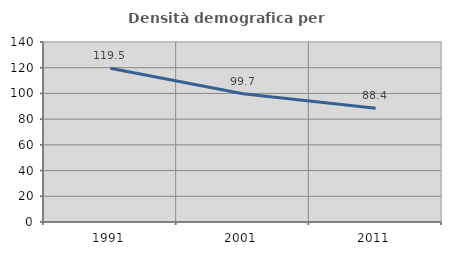
| Category | Densità demografica |
|---|---|
| 1991.0 | 119.521 |
| 2001.0 | 99.722 |
| 2011.0 | 88.416 |